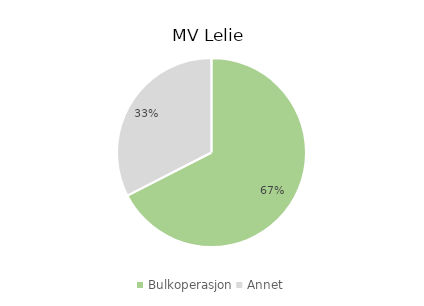
| Category | Series 0 |
|---|---|
| Bulkoperasjon | 0.674 |
| Annet | 0.326 |